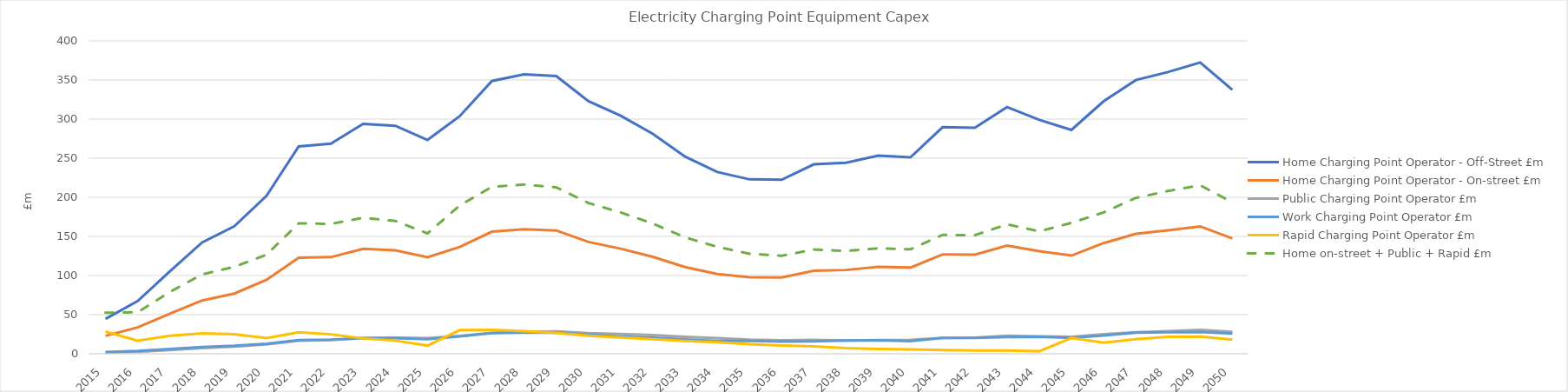
| Category | Home Charging Point Operator - Off-Street | Home Charging Point Operator - On-street | Public Charging Point Operator | Work Charging Point Operator | Rapid Charging Point Operator | Home on-street + Public + Rapid |
|---|---|---|---|---|---|---|
| 2015.0 | 44.542 | 22.946 | 1.315 | 2.257 | 28.275 | 52.536 |
| 2016.0 | 67.512 | 33.689 | 2.636 | 3.748 | 16.721 | 53.046 |
| 2017.0 | 105.371 | 51.362 | 4.779 | 6.184 | 22.927 | 79.067 |
| 2018.0 | 142.325 | 68.137 | 7.234 | 8.682 | 26.071 | 101.443 |
| 2019.0 | 162.987 | 76.991 | 9.038 | 10.262 | 25.089 | 111.118 |
| 2020.0 | 201.973 | 94.49 | 11.946 | 12.759 | 20.115 | 126.551 |
| 2021.0 | 265.043 | 122.794 | 16.549 | 17.445 | 27.393 | 166.736 |
| 2022.0 | 268.692 | 123.521 | 17.622 | 18.155 | 24.859 | 166.002 |
| 2023.0 | 293.787 | 134.124 | 20.078 | 19.879 | 19.58 | 173.781 |
| 2024.0 | 291.516 | 132.319 | 20.649 | 20.095 | 16.814 | 169.782 |
| 2025.0 | 273.269 | 123.456 | 19.937 | 18.509 | 10.469 | 153.862 |
| 2026.0 | 303.667 | 136.56 | 22.737 | 22.207 | 30.208 | 189.505 |
| 2027.0 | 348.628 | 156.05 | 26.786 | 26.485 | 30.552 | 213.388 |
| 2028.0 | 357.28 | 159.248 | 28.143 | 26.832 | 28.901 | 216.293 |
| 2029.0 | 354.949 | 157.615 | 28.595 | 27.141 | 26.546 | 212.755 |
| 2030.0 | 322.915 | 142.945 | 26.524 | 24.318 | 23.178 | 192.647 |
| 2031.0 | 304.21 | 134.3 | 25.401 | 21.914 | 20.954 | 180.655 |
| 2032.0 | 281.217 | 123.859 | 23.818 | 20.654 | 18.745 | 166.422 |
| 2033.0 | 252.042 | 110.791 | 21.608 | 18.38 | 16.389 | 148.787 |
| 2034.0 | 232.337 | 101.953 | 20.128 | 16.489 | 14.611 | 136.691 |
| 2035.0 | 222.949 | 97.75 | 17.92 | 16.403 | 12.195 | 127.865 |
| 2036.0 | 222.398 | 97.462 | 17.212 | 15.557 | 10.578 | 125.252 |
| 2037.0 | 242.152 | 106.111 | 17.801 | 15.868 | 9.347 | 133.259 |
| 2038.0 | 244.289 | 107.082 | 17.002 | 16.919 | 7.297 | 131.381 |
| 2039.0 | 253.355 | 111.095 | 17.514 | 17.113 | 6.191 | 134.801 |
| 2040.0 | 251.137 | 110.142 | 17.758 | 16.236 | 5.576 | 133.476 |
| 2041.0 | 289.589 | 127.044 | 20.178 | 20.266 | 4.748 | 151.969 |
| 2042.0 | 288.938 | 126.773 | 20.574 | 20.357 | 4.159 | 151.507 |
| 2043.0 | 315.335 | 138.346 | 23.003 | 21.466 | 4.114 | 165.463 |
| 2044.0 | 299.041 | 131.178 | 22.091 | 21.621 | 3.195 | 156.464 |
| 2045.0 | 286.151 | 125.485 | 21.693 | 20.263 | 20.155 | 167.333 |
| 2046.0 | 322.706 | 141.448 | 25.011 | 23.284 | 14.211 | 180.67 |
| 2047.0 | 349.825 | 153.25 | 27.375 | 27.001 | 18.583 | 199.208 |
| 2048.0 | 360.17 | 157.673 | 28.799 | 27.427 | 21.6 | 208.072 |
| 2049.0 | 372.348 | 162.866 | 30.514 | 27.914 | 21.957 | 215.337 |
| 2050.0 | 337.322 | 147.425 | 28.086 | 25.7 | 18.077 | 193.588 |